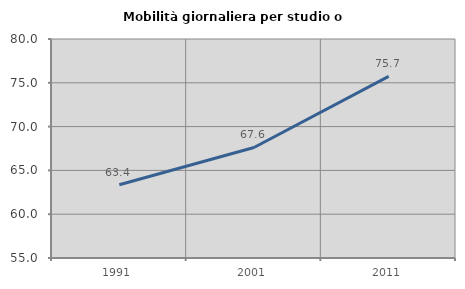
| Category | Mobilità giornaliera per studio o lavoro |
|---|---|
| 1991.0 | 63.368 |
| 2001.0 | 67.616 |
| 2011.0 | 75.727 |